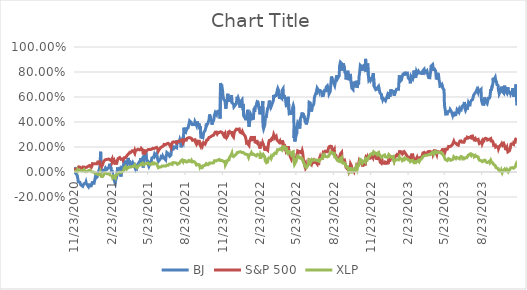
| Category | BJ | S&P 500 | XLP |
|---|---|---|---|
| 11/23/20 | 0.038 | 0.006 | 0 |
| 11/24/20 | 0.029 | 0.022 | 0.007 |
| 11/25/20 | -0.004 | 0.021 | 0.006 |
| 11/27/20 | -0.011 | 0.023 | 0.006 |
| 11/30/20 | -0.024 | 0.019 | 0.006 |
| 12/1/20 | -0.038 | 0.03 | 0.015 |
| 12/2/20 | -0.054 | 0.032 | 0.007 |
| 12/3/20 | -0.078 | 0.032 | 0.009 |
| 12/4/20 | -0.079 | 0.041 | 0.017 |
| 12/7/20 | -0.082 | 0.039 | 0.013 |
| 12/8/20 | -0.078 | 0.042 | 0.019 |
| 12/9/20 | -0.102 | 0.032 | 0.015 |
| 12/10/20 | -0.097 | 0.032 | 0.01 |
| 12/11/20 | -0.106 | 0.031 | 0.012 |
| 12/14/20 | -0.114 | 0.026 | 0.008 |
| 12/15/20 | -0.116 | 0.04 | 0.011 |
| 12/16/20 | -0.115 | 0.042 | 0.013 |
| 12/17/20 | -0.094 | 0.048 | 0.019 |
| 12/18/20 | -0.088 | 0.039 | 0.022 |
| 12/21/20 | -0.09 | 0.035 | 0.002 |
| 12/22/20 | -0.08 | 0.034 | -0.005 |
| 12/23/20 | -0.093 | 0.034 | -0.002 |
| 12/24/20 | -0.09 | 0.038 | 0.003 |
| 12/28/20 | -0.117 | 0.047 | 0.011 |
| 12/29/20 | -0.111 | 0.045 | 0.008 |
| 12/30/20 | -0.093 | 0.047 | 0.007 |
| 12/31/20 | -0.112 | 0.052 | 0.014 |
| 1/4/21 | -0.111 | 0.038 | 0.003 |
| 1/5/21 | -0.113 | 0.045 | 0.003 |
| 1/6/21 | -0.091 | 0.051 | 0.004 |
| 1/7/21 | -0.075 | 0.067 | 0.001 |
| 1/8/21 | -0.09 | 0.073 | 0.006 |
| 1/11/21 | -0.09 | 0.066 | -0.003 |
| 1/12/21 | -0.092 | 0.066 | -0.006 |
| 1/13/21 | -0.09 | 0.069 | -0.004 |
| 1/14/21 | -0.04 | 0.065 | -0.01 |
| 1/15/21 | -0.05 | 0.057 | -0.013 |
| 1/19/21 | -0.037 | 0.066 | -0.017 |
| 1/20/21 | -0.008 | 0.08 | -0.016 |
| 1/21/21 | -0.001 | 0.081 | -0.019 |
| 1/22/21 | 0.006 | 0.078 | -0.022 |
| 1/25/21 | 0.035 | 0.082 | -0.012 |
| 1/26/21 | 0.087 | 0.08 | -0.003 |
| 1/27/21 | 0.162 | 0.054 | -0.02 |
| 1/28/21 | 0.039 | 0.063 | -0.016 |
| 1/29/21 | 0.002 | 0.041 | -0.036 |
| 2/1/21 | 0.011 | 0.059 | -0.035 |
| 2/2/21 | 0.018 | 0.074 | -0.029 |
| 2/3/21 | 0.016 | 0.075 | -0.027 |
| 2/4/21 | 0.001 | 0.087 | -0.02 |
| 2/5/21 | -0.003 | 0.091 | -0.011 |
| 2/8/21 | 0.033 | 0.099 | -0.007 |
| 2/9/21 | 0.041 | 0.098 | -0.008 |
| 2/10/21 | 0.04 | 0.098 | -0.009 |
| 2/11/21 | 0.02 | 0.1 | -0.014 |
| 2/12/21 | 0.024 | 0.105 | -0.012 |
| 2/16/21 | 0.035 | 0.104 | -0.014 |
| 2/17/21 | 0.043 | 0.104 | -0.01 |
| 2/18/21 | 0.066 | 0.1 | -0.011 |
| 2/19/21 | 0.063 | 0.098 | -0.023 |
| 2/22/21 | 0.027 | 0.089 | -0.023 |
| 2/23/21 | -0.004 | 0.091 | -0.021 |
| 2/24/21 | 0.013 | 0.103 | -0.022 |
| 2/25/21 | -0.026 | 0.076 | -0.032 |
| 2/26/21 | -0.043 | 0.07 | -0.048 |
| 3/1/21 | -0.052 | 0.096 | -0.038 |
| 3/2/21 | -0.075 | 0.088 | -0.04 |
| 3/3/21 | -0.081 | 0.073 | -0.045 |
| 3/4/21 | -0.091 | 0.06 | -0.048 |
| 3/5/21 | -0.069 | 0.08 | -0.027 |
| 3/8/21 | -0.032 | 0.074 | -0.023 |
| 3/9/21 | 0.009 | 0.09 | -0.024 |
| 3/10/21 | 0.037 | 0.096 | -0.011 |
| 3/11/21 | 0.004 | 0.108 | -0.013 |
| 3/12/21 | 0.008 | 0.109 | -0.005 |
| 3/15/21 | 0.024 | 0.116 | -0.001 |
| 3/16/21 | 0.001 | 0.114 | 0 |
| 3/17/21 | 0.005 | 0.118 | -0.001 |
| 3/18/21 | -0.036 | 0.102 | -0.005 |
| 3/19/21 | 0.001 | 0.096 | -0.002 |
| 3/22/21 | 0.049 | 0.105 | 0.003 |
| 3/23/21 | 0.045 | 0.096 | 0.008 |
| 3/24/21 | 0.024 | 0.091 | 0.004 |
| 3/25/21 | 0.031 | 0.097 | 0.013 |
| 3/26/21 | 0.088 | 0.114 | 0.031 |
| 3/29/21 | 0.077 | 0.114 | 0.042 |
| 3/30/21 | 0.069 | 0.111 | 0.031 |
| 3/31/21 | 0.068 | 0.115 | 0.027 |
| 4/1/21 | 0.058 | 0.127 | 0.022 |
| 4/5/21 | 0.113 | 0.144 | 0.035 |
| 4/6/21 | 0.083 | 0.143 | 0.04 |
| 4/7/21 | 0.096 | 0.144 | 0.037 |
| 4/8/21 | 0.067 | 0.15 | 0.038 |
| 4/9/21 | 0.056 | 0.158 | 0.036 |
| 4/12/21 | 0.066 | 0.158 | 0.042 |
| 4/13/21 | 0.057 | 0.162 | 0.036 |
| 4/14/21 | 0.059 | 0.158 | 0.035 |
| 4/15/21 | 0.064 | 0.17 | 0.044 |
| 4/16/21 | 0.076 | 0.174 | 0.05 |
| 4/19/21 | 0.058 | 0.169 | 0.046 |
| 4/20/21 | 0.049 | 0.16 | 0.051 |
| 4/21/21 | 0.047 | 0.171 | 0.057 |
| 4/22/21 | 0.031 | 0.16 | 0.049 |
| 4/23/21 | 0.047 | 0.173 | 0.046 |
| 4/26/21 | 0.03 | 0.175 | 0.034 |
| 4/27/21 | 0.028 | 0.175 | 0.034 |
| 4/28/21 | 0.055 | 0.175 | 0.034 |
| 4/29/21 | 0.064 | 0.182 | 0.045 |
| 4/30/21 | 0.064 | 0.174 | 0.046 |
| 5/3/21 | 0.084 | 0.177 | 0.055 |
| 5/4/21 | 0.067 | 0.17 | 0.049 |
| 5/5/21 | 0.087 | 0.17 | 0.049 |
| 5/6/21 | 0.112 | 0.179 | 0.062 |
| 5/7/21 | 0.092 | 0.188 | 0.062 |
| 5/10/21 | 0.11 | 0.176 | 0.07 |
| 5/11/21 | 0.107 | 0.166 | 0.061 |
| 5/12/21 | 0.035 | 0.141 | 0.047 |
| 5/13/21 | 0.095 | 0.155 | 0.062 |
| 5/14/21 | 0.125 | 0.172 | 0.066 |
| 5/17/21 | 0.136 | 0.169 | 0.065 |
| 5/18/21 | 0.161 | 0.159 | 0.062 |
| 5/19/21 | 0.157 | 0.156 | 0.058 |
| 5/20/21 | 0.099 | 0.169 | 0.068 |
| 5/21/21 | 0.087 | 0.168 | 0.068 |
| 5/24/21 | 0.06 | 0.18 | 0.071 |
| 5/25/21 | 0.052 | 0.177 | 0.071 |
| 5/26/21 | 0.065 | 0.179 | 0.069 |
| 5/27/21 | 0.057 | 0.18 | 0.063 |
| 5/28/21 | 0.066 | 0.182 | 0.065 |
| 6/1/21 | 0.089 | 0.181 | 0.061 |
| 6/2/21 | 0.112 | 0.183 | 0.065 |
| 6/3/21 | 0.116 | 0.179 | 0.072 |
| 6/4/21 | 0.113 | 0.189 | 0.075 |
| 6/7/21 | 0.123 | 0.188 | 0.074 |
| 6/8/21 | 0.135 | 0.188 | 0.065 |
| 6/9/21 | 0.125 | 0.187 | 0.06 |
| 6/10/21 | 0.128 | 0.192 | 0.066 |
| 6/11/21 | 0.135 | 0.194 | 0.067 |
| 6/14/21 | 0.149 | 0.197 | 0.066 |
| 6/15/21 | 0.127 | 0.195 | 0.064 |
| 6/16/21 | 0.109 | 0.188 | 0.049 |
| 6/17/21 | 0.115 | 0.188 | 0.053 |
| 6/18/21 | 0.084 | 0.168 | 0.035 |
| 6/21/21 | 0.096 | 0.184 | 0.04 |
| 6/22/21 | 0.103 | 0.191 | 0.041 |
| 6/23/21 | 0.09 | 0.189 | 0.035 |
| 6/24/21 | 0.11 | 0.196 | 0.04 |
| 6/25/21 | 0.123 | 0.201 | 0.048 |
| 6/28/21 | 0.116 | 0.203 | 0.049 |
| 6/29/21 | 0.128 | 0.204 | 0.044 |
| 6/30/21 | 0.133 | 0.205 | 0.052 |
| 7/1/21 | 0.116 | 0.211 | 0.049 |
| 7/2/21 | 0.124 | 0.221 | 0.052 |
| 7/6/21 | 0.097 | 0.218 | 0.047 |
| 7/7/21 | 0.123 | 0.223 | 0.053 |
| 7/8/21 | 0.135 | 0.213 | 0.049 |
| 7/9/21 | 0.156 | 0.226 | 0.055 |
| 7/12/21 | 0.147 | 0.23 | 0.053 |
| 7/13/21 | 0.139 | 0.226 | 0.053 |
| 7/14/21 | 0.135 | 0.228 | 0.062 |
| 7/15/21 | 0.138 | 0.224 | 0.067 |
| 7/16/21 | 0.125 | 0.214 | 0.068 |
| 7/19/21 | 0.135 | 0.196 | 0.065 |
| 7/20/21 | 0.168 | 0.213 | 0.065 |
| 7/21/21 | 0.187 | 0.223 | 0.063 |
| 7/22/21 | 0.19 | 0.226 | 0.061 |
| 7/23/21 | 0.205 | 0.238 | 0.074 |
| 7/26/21 | 0.188 | 0.241 | 0.075 |
| 7/27/21 | 0.187 | 0.235 | 0.078 |
| 7/28/21 | 0.186 | 0.235 | 0.068 |
| 7/29/21 | 0.2 | 0.24 | 0.074 |
| 7/30/21 | 0.206 | 0.234 | 0.075 |
| 8/2/21 | 0.194 | 0.232 | 0.071 |
| 8/3/21 | 0.256 | 0.242 | 0.076 |
| 8/4/21 | 0.232 | 0.235 | 0.062 |
| 8/5/21 | 0.237 | 0.243 | 0.067 |
| 8/6/21 | 0.234 | 0.245 | 0.067 |
| 8/9/21 | 0.244 | 0.244 | 0.071 |
| 8/10/21 | 0.259 | 0.246 | 0.078 |
| 8/11/21 | 0.25 | 0.249 | 0.082 |
| 8/12/21 | 0.228 | 0.253 | 0.081 |
| 8/13/21 | 0.197 | 0.255 | 0.09 |
| 8/16/21 | 0.249 | 0.258 | 0.097 |
| 8/17/21 | 0.256 | 0.25 | 0.097 |
| 8/18/21 | 0.236 | 0.236 | 0.084 |
| 8/19/21 | 0.286 | 0.238 | 0.092 |
| 8/20/21 | 0.355 | 0.248 | 0.094 |
| 8/23/21 | 0.307 | 0.259 | 0.091 |
| 8/24/21 | 0.319 | 0.261 | 0.082 |
| 8/25/21 | 0.349 | 0.263 | 0.081 |
| 8/26/21 | 0.337 | 0.256 | 0.076 |
| 8/27/21 | 0.347 | 0.267 | 0.079 |
| 8/30/21 | 0.351 | 0.273 | 0.084 |
| 8/31/21 | 0.349 | 0.271 | 0.087 |
| 9/1/21 | 0.349 | 0.271 | 0.092 |
| 9/2/21 | 0.392 | 0.275 | 0.097 |
| 9/3/21 | 0.409 | 0.275 | 0.095 |
| 9/7/21 | 0.397 | 0.271 | 0.083 |
| 9/8/21 | 0.391 | 0.269 | 0.092 |
| 9/9/21 | 0.38 | 0.264 | 0.086 |
| 9/10/21 | 0.387 | 0.254 | 0.081 |
| 9/13/21 | 0.38 | 0.257 | 0.084 |
| 9/14/21 | 0.369 | 0.25 | 0.079 |
| 9/15/21 | 0.387 | 0.26 | 0.083 |
| 9/16/21 | 0.402 | 0.258 | 0.079 |
| 9/17/21 | 0.399 | 0.242 | 0.073 |
| 9/20/21 | 0.371 | 0.222 | 0.056 |
| 9/21/21 | 0.393 | 0.22 | 0.055 |
| 9/22/21 | 0.404 | 0.232 | 0.058 |
| 9/23/21 | 0.384 | 0.247 | 0.062 |
| 9/24/21 | 0.39 | 0.249 | 0.062 |
| 9/27/21 | 0.38 | 0.246 | 0.057 |
| 9/28/21 | 0.342 | 0.221 | 0.045 |
| 9/29/21 | 0.367 | 0.223 | 0.054 |
| 9/30/21 | 0.308 | 0.208 | 0.035 |
| 10/1/21 | 0.269 | 0.222 | 0.038 |
| 10/4/21 | 0.292 | 0.206 | 0.035 |
| 10/5/21 | 0.298 | 0.219 | 0.04 |
| 10/6/21 | 0.282 | 0.224 | 0.05 |
| 10/7/21 | 0.303 | 0.235 | 0.055 |
| 10/8/21 | 0.318 | 0.232 | 0.053 |
| 10/11/21 | 0.332 | 0.223 | 0.053 |
| 10/12/21 | 0.335 | 0.22 | 0.054 |
| 10/13/21 | 0.356 | 0.225 | 0.055 |
| 10/14/21 | 0.387 | 0.245 | 0.067 |
| 10/15/21 | 0.374 | 0.255 | 0.065 |
| 10/18/21 | 0.39 | 0.259 | 0.058 |
| 10/19/21 | 0.398 | 0.268 | 0.059 |
| 10/20/21 | 0.39 | 0.273 | 0.065 |
| 10/21/21 | 0.422 | 0.277 | 0.064 |
| 10/22/21 | 0.46 | 0.275 | 0.072 |
| 10/25/21 | 0.429 | 0.282 | 0.071 |
| 10/26/21 | 0.425 | 0.283 | 0.075 |
| 10/27/21 | 0.408 | 0.278 | 0.069 |
| 10/28/21 | 0.379 | 0.29 | 0.072 |
| 10/29/21 | 0.391 | 0.292 | 0.071 |
| 11/1/21 | 0.413 | 0.295 | 0.073 |
| 11/2/21 | 0.427 | 0.3 | 0.08 |
| 11/3/21 | 0.456 | 0.308 | 0.09 |
| 11/4/21 | 0.465 | 0.314 | 0.091 |
| 11/5/21 | 0.476 | 0.319 | 0.098 |
| 11/8/21 | 0.46 | 0.32 | 0.089 |
| 11/9/21 | 0.49 | 0.315 | 0.093 |
| 11/10/21 | 0.47 | 0.305 | 0.096 |
| 11/11/21 | 0.457 | 0.305 | 0.095 |
| 11/12/21 | 0.486 | 0.315 | 0.095 |
| 11/15/21 | 0.486 | 0.315 | 0.101 |
| 11/16/21 | 0.466 | 0.321 | 0.094 |
| 11/17/21 | 0.428 | 0.317 | 0.091 |
| 11/18/21 | 0.713 | 0.322 | 0.087 |
| 11/19/21 | 0.657 | 0.32 | 0.083 |
| 11/22/21 | 0.675 | 0.316 | 0.092 |
| 11/23/21 | 0.653 | 0.318 | 0.099 |
| 11/24/21 | 0.612 | 0.321 | 0.096 |
| 11/26/21 | 0.58 | 0.292 | 0.082 |
| 11/29/21 | 0.569 | 0.308 | 0.085 |
| 11/30/21 | 0.575 | 0.282 | 0.057 |
| 12/1/21 | 0.506 | 0.268 | 0.052 |
| 12/2/21 | 0.533 | 0.287 | 0.063 |
| 12/3/21 | 0.548 | 0.276 | 0.076 |
| 12/6/21 | 0.626 | 0.291 | 0.095 |
| 12/7/21 | 0.621 | 0.318 | 0.098 |
| 12/8/21 | 0.571 | 0.321 | 0.094 |
| 12/9/21 | 0.562 | 0.312 | 0.097 |
| 12/10/21 | 0.605 | 0.325 | 0.116 |
| 12/13/21 | 0.585 | 0.313 | 0.13 |
| 12/14/21 | 0.567 | 0.304 | 0.131 |
| 12/15/21 | 0.614 | 0.324 | 0.142 |
| 12/16/21 | 0.554 | 0.313 | 0.151 |
| 12/17/21 | 0.558 | 0.294 | 0.131 |
| 12/20/21 | 0.543 | 0.28 | 0.123 |
| 12/21/21 | 0.521 | 0.303 | 0.122 |
| 12/22/21 | 0.527 | 0.316 | 0.129 |
| 12/23/21 | 0.53 | 0.324 | 0.132 |
| 12/27/21 | 0.547 | 0.343 | 0.144 |
| 12/28/21 | 0.579 | 0.342 | 0.15 |
| 12/29/21 | 0.602 | 0.344 | 0.155 |
| 12/30/21 | 0.586 | 0.34 | 0.152 |
| 12/31/21 | 0.595 | 0.337 | 0.16 |
| 1/3/22 | 0.564 | 0.344 | 0.159 |
| 1/4/22 | 0.56 | 0.344 | 0.167 |
| 1/5/22 | 0.515 | 0.318 | 0.166 |
| 1/6/22 | 0.544 | 0.317 | 0.163 |
| 1/7/22 | 0.564 | 0.312 | 0.164 |
| 1/10/22 | 0.577 | 0.31 | 0.155 |
| 1/11/22 | 0.532 | 0.322 | 0.154 |
| 1/12/22 | 0.538 | 0.326 | 0.154 |
| 1/13/22 | 0.545 | 0.307 | 0.156 |
| 1/14/22 | 0.448 | 0.308 | 0.158 |
| 1/18/22 | 0.428 | 0.285 | 0.142 |
| 1/19/22 | 0.414 | 0.271 | 0.149 |
| 1/20/22 | 0.412 | 0.257 | 0.141 |
| 1/21/22 | 0.441 | 0.233 | 0.142 |
| 1/24/22 | 0.497 | 0.238 | 0.138 |
| 1/25/22 | 0.449 | 0.223 | 0.126 |
| 1/26/22 | 0.398 | 0.22 | 0.117 |
| 1/27/22 | 0.362 | 0.214 | 0.125 |
| 1/28/22 | 0.379 | 0.244 | 0.138 |
| 1/31/22 | 0.464 | 0.266 | 0.142 |
| 2/1/22 | 0.468 | 0.275 | 0.141 |
| 2/2/22 | 0.451 | 0.287 | 0.155 |
| 2/3/22 | 0.45 | 0.257 | 0.155 |
| 2/4/22 | 0.425 | 0.263 | 0.141 |
| 2/7/22 | 0.428 | 0.259 | 0.143 |
| 2/8/22 | 0.49 | 0.269 | 0.148 |
| 2/9/22 | 0.51 | 0.288 | 0.148 |
| 2/10/22 | 0.48 | 0.265 | 0.136 |
| 2/11/22 | 0.518 | 0.24 | 0.132 |
| 2/14/22 | 0.531 | 0.236 | 0.128 |
| 2/15/22 | 0.545 | 0.255 | 0.13 |
| 2/16/22 | 0.537 | 0.257 | 0.132 |
| 2/17/22 | 0.57 | 0.23 | 0.141 |
| 2/18/22 | 0.568 | 0.222 | 0.143 |
| 2/22/22 | 0.495 | 0.209 | 0.134 |
| 2/23/22 | 0.461 | 0.187 | 0.125 |
| 2/24/22 | 0.484 | 0.205 | 0.106 |
| 2/25/22 | 0.524 | 0.232 | 0.142 |
| 2/28/22 | 0.497 | 0.229 | 0.126 |
| 3/1/22 | 0.509 | 0.21 | 0.12 |
| 3/2/22 | 0.569 | 0.232 | 0.132 |
| 3/3/22 | 0.361 | 0.226 | 0.141 |
| 3/4/22 | 0.346 | 0.216 | 0.141 |
| 3/7/22 | 0.376 | 0.18 | 0.12 |
| 3/8/22 | 0.419 | 0.171 | 0.09 |
| 3/9/22 | 0.447 | 0.203 | 0.097 |
| 3/10/22 | 0.434 | 0.197 | 0.087 |
| 3/11/22 | 0.453 | 0.182 | 0.074 |
| 3/14/22 | 0.51 | 0.174 | 0.08 |
| 3/15/22 | 0.511 | 0.199 | 0.104 |
| 3/16/22 | 0.522 | 0.226 | 0.105 |
| 3/17/22 | 0.543 | 0.241 | 0.113 |
| 3/18/22 | 0.571 | 0.251 | 0.116 |
| 3/21/22 | 0.526 | 0.251 | 0.112 |
| 3/22/22 | 0.535 | 0.265 | 0.12 |
| 3/23/22 | 0.527 | 0.249 | 0.111 |
| 3/24/22 | 0.534 | 0.268 | 0.119 |
| 3/25/22 | 0.527 | 0.274 | 0.128 |
| 3/28/22 | 0.572 | 0.283 | 0.133 |
| 3/29/22 | 0.616 | 0.299 | 0.143 |
| 3/30/22 | 0.596 | 0.291 | 0.144 |
| 3/31/22 | 0.61 | 0.271 | 0.141 |
| 4/1/22 | 0.61 | 0.275 | 0.153 |
| 4/4/22 | 0.612 | 0.286 | 0.149 |
| 4/5/22 | 0.611 | 0.269 | 0.15 |
| 4/6/22 | 0.619 | 0.257 | 0.165 |
| 4/7/22 | 0.658 | 0.263 | 0.179 |
| 4/8/22 | 0.669 | 0.26 | 0.184 |
| 4/11/22 | 0.644 | 0.238 | 0.179 |
| 4/12/22 | 0.584 | 0.233 | 0.179 |
| 4/13/22 | 0.62 | 0.248 | 0.186 |
| 4/14/22 | 0.604 | 0.232 | 0.186 |
| 4/18/22 | 0.589 | 0.233 | 0.176 |
| 4/19/22 | 0.656 | 0.252 | 0.194 |
| 4/20/22 | 0.663 | 0.252 | 0.212 |
| 4/21/22 | 0.666 | 0.233 | 0.211 |
| 4/22/22 | 0.6 | 0.199 | 0.192 |
| 4/25/22 | 0.603 | 0.206 | 0.197 |
| 4/26/22 | 0.585 | 0.171 | 0.178 |
| 4/27/22 | 0.598 | 0.174 | 0.183 |
| 4/28/22 | 0.601 | 0.204 | 0.2 |
| 4/29/22 | 0.532 | 0.159 | 0.168 |
| 5/2/22 | 0.537 | 0.166 | 0.152 |
| 5/3/22 | 0.557 | 0.172 | 0.149 |
| 5/4/22 | 0.601 | 0.207 | 0.175 |
| 5/5/22 | 0.505 | 0.165 | 0.152 |
| 5/6/22 | 0.469 | 0.158 | 0.154 |
| 5/9/22 | 0.475 | 0.121 | 0.153 |
| 5/10/22 | 0.458 | 0.123 | 0.145 |
| 5/11/22 | 0.452 | 0.105 | 0.14 |
| 5/12/22 | 0.486 | 0.104 | 0.14 |
| 5/13/22 | 0.484 | 0.131 | 0.157 |
| 5/16/22 | 0.532 | 0.126 | 0.162 |
| 5/17/22 | 0.519 | 0.149 | 0.154 |
| 5/18/22 | 0.272 | 0.103 | 0.08 |
| 5/19/22 | 0.366 | 0.096 | 0.061 |
| 5/20/22 | 0.245 | 0.097 | 0.063 |
| 5/23/22 | 0.299 | 0.117 | 0.085 |
| 5/24/22 | 0.296 | 0.109 | 0.103 |
| 5/25/22 | 0.31 | 0.118 | 0.103 |
| 5/26/22 | 0.378 | 0.141 | 0.115 |
| 5/27/22 | 0.396 | 0.169 | 0.128 |
| 5/31/22 | 0.378 | 0.162 | 0.12 |
| 6/1/22 | 0.348 | 0.153 | 0.105 |
| 6/2/22 | 0.418 | 0.175 | 0.121 |
| 6/3/22 | 0.424 | 0.155 | 0.11 |
| 6/6/22 | 0.458 | 0.159 | 0.111 |
| 6/7/22 | 0.476 | 0.17 | 0.116 |
| 6/8/22 | 0.435 | 0.157 | 0.103 |
| 6/9/22 | 0.468 | 0.13 | 0.086 |
| 6/10/22 | 0.461 | 0.097 | 0.082 |
| 6/13/22 | 0.43 | 0.055 | 0.058 |
| 6/14/22 | 0.405 | 0.052 | 0.046 |
| 6/15/22 | 0.412 | 0.067 | 0.047 |
| 6/16/22 | 0.395 | 0.032 | 0.039 |
| 6/17/22 | 0.38 | 0.03 | 0.035 |
| 6/21/22 | 0.432 | 0.056 | 0.055 |
| 6/22/22 | 0.429 | 0.054 | 0.054 |
| 6/23/22 | 0.465 | 0.064 | 0.074 |
| 6/24/22 | 0.558 | 0.098 | 0.095 |
| 6/27/22 | 0.552 | 0.094 | 0.092 |
| 6/28/22 | 0.515 | 0.071 | 0.078 |
| 6/29/22 | 0.496 | 0.07 | 0.085 |
| 6/30/22 | 0.484 | 0.062 | 0.085 |
| 7/1/22 | 0.515 | 0.073 | 0.101 |
| 7/5/22 | 0.54 | 0.075 | 0.094 |
| 7/6/22 | 0.554 | 0.079 | 0.097 |
| 7/7/22 | 0.594 | 0.095 | 0.098 |
| 7/8/22 | 0.607 | 0.094 | 0.096 |
| 7/11/22 | 0.634 | 0.081 | 0.095 |
| 7/12/22 | 0.62 | 0.072 | 0.092 |
| 7/13/22 | 0.623 | 0.066 | 0.092 |
| 7/14/22 | 0.67 | 0.064 | 0.093 |
| 7/15/22 | 0.664 | 0.084 | 0.097 |
| 7/18/22 | 0.65 | 0.075 | 0.086 |
| 7/19/22 | 0.642 | 0.104 | 0.098 |
| 7/20/22 | 0.661 | 0.111 | 0.09 |
| 7/21/22 | 0.646 | 0.122 | 0.094 |
| 7/22/22 | 0.654 | 0.112 | 0.101 |
| 7/25/22 | 0.642 | 0.113 | 0.106 |
| 7/26/22 | 0.611 | 0.1 | 0.104 |
| 7/27/22 | 0.619 | 0.129 | 0.111 |
| 7/28/22 | 0.612 | 0.143 | 0.129 |
| 7/29/22 | 0.612 | 0.159 | 0.12 |
| 8/1/22 | 0.653 | 0.156 | 0.134 |
| 8/2/22 | 0.649 | 0.148 | 0.125 |
| 8/3/22 | 0.654 | 0.166 | 0.132 |
| 8/4/22 | 0.651 | 0.166 | 0.125 |
| 8/5/22 | 0.679 | 0.164 | 0.122 |
| 8/8/22 | 0.69 | 0.162 | 0.122 |
| 8/9/22 | 0.679 | 0.158 | 0.12 |
| 8/10/22 | 0.686 | 0.182 | 0.128 |
| 8/11/22 | 0.656 | 0.182 | 0.126 |
| 8/12/22 | 0.626 | 0.202 | 0.135 |
| 8/15/22 | 0.645 | 0.207 | 0.147 |
| 8/16/22 | 0.649 | 0.209 | 0.16 |
| 8/17/22 | 0.646 | 0.201 | 0.156 |
| 8/18/22 | 0.764 | 0.204 | 0.16 |
| 8/19/22 | 0.757 | 0.188 | 0.157 |
| 8/22/22 | 0.719 | 0.163 | 0.145 |
| 8/23/22 | 0.72 | 0.16 | 0.14 |
| 8/24/22 | 0.708 | 0.164 | 0.143 |
| 8/25/22 | 0.715 | 0.181 | 0.148 |
| 8/26/22 | 0.692 | 0.141 | 0.12 |
| 8/29/22 | 0.745 | 0.133 | 0.118 |
| 8/30/22 | 0.746 | 0.121 | 0.106 |
| 8/31/22 | 0.774 | 0.112 | 0.099 |
| 9/1/22 | 0.773 | 0.116 | 0.106 |
| 9/2/22 | 0.747 | 0.104 | 0.091 |
| 9/6/22 | 0.77 | 0.1 | 0.085 |
| 9/7/22 | 0.847 | 0.119 | 0.105 |
| 9/8/22 | 0.865 | 0.127 | 0.102 |
| 9/9/22 | 0.879 | 0.144 | 0.112 |
| 9/12/22 | 0.868 | 0.157 | 0.117 |
| 9/13/22 | 0.811 | 0.106 | 0.08 |
| 9/14/22 | 0.837 | 0.111 | 0.079 |
| 9/15/22 | 0.82 | 0.098 | 0.07 |
| 9/16/22 | 0.868 | 0.085 | 0.073 |
| 9/19/22 | 0.831 | 0.093 | 0.073 |
| 9/20/22 | 0.798 | 0.081 | 0.067 |
| 9/21/22 | 0.801 | 0.062 | 0.063 |
| 9/22/22 | 0.786 | 0.053 | 0.061 |
| 9/23/22 | 0.741 | 0.036 | 0.043 |
| 9/26/22 | 0.796 | 0.025 | 0.044 |
| 9/27/22 | 0.81 | 0.023 | 0.026 |
| 9/28/22 | 0.811 | 0.043 | 0.038 |
| 9/29/22 | 0.773 | 0.021 | 0.021 |
| 9/30/22 | 0.734 | 0.005 | 0.003 |
| 10/3/22 | 0.784 | 0.032 | 0.021 |
| 10/4/22 | 0.773 | 0.064 | 0.036 |
| 10/5/22 | 0.72 | 0.061 | 0.03 |
| 10/6/22 | 0.698 | 0.05 | 0.015 |
| 10/7/22 | 0.672 | 0.021 | 0 |
| 10/10/22 | 0.66 | 0.013 | 0.004 |
| 10/11/22 | 0.722 | 0.007 | 0.012 |
| 10/12/22 | 0.705 | 0.003 | 0.017 |
| 10/13/22 | 0.719 | 0.03 | 0.034 |
| 10/14/22 | 0.691 | 0.006 | 0.015 |
| 10/17/22 | 0.701 | 0.032 | 0.026 |
| 10/18/22 | 0.73 | 0.044 | 0.04 |
| 10/19/22 | 0.713 | 0.037 | 0.035 |
| 10/20/22 | 0.672 | 0.028 | 0.021 |
| 10/21/22 | 0.695 | 0.053 | 0.036 |
| 10/24/22 | 0.708 | 0.066 | 0.055 |
| 10/25/22 | 0.767 | 0.083 | 0.069 |
| 10/26/22 | 0.786 | 0.075 | 0.076 |
| 10/27/22 | 0.82 | 0.069 | 0.077 |
| 10/28/22 | 0.853 | 0.095 | 0.1 |
| 10/31/22 | 0.843 | 0.087 | 0.094 |
| 11/1/22 | 0.853 | 0.082 | 0.09 |
| 11/2/22 | 0.812 | 0.055 | 0.071 |
| 11/3/22 | 0.849 | 0.044 | 0.068 |
| 11/4/22 | 0.826 | 0.059 | 0.08 |
| 11/7/22 | 0.862 | 0.069 | 0.09 |
| 11/8/22 | 0.839 | 0.075 | 0.093 |
| 11/9/22 | 0.847 | 0.053 | 0.081 |
| 11/10/22 | 0.905 | 0.111 | 0.107 |
| 11/11/22 | 0.813 | 0.122 | 0.106 |
| 11/14/22 | 0.813 | 0.112 | 0.097 |
| 11/15/22 | 0.868 | 0.121 | 0.106 |
| 11/16/22 | 0.866 | 0.113 | 0.111 |
| 11/17/22 | 0.762 | 0.11 | 0.111 |
| 11/18/22 | 0.731 | 0.115 | 0.123 |
| 11/21/22 | 0.741 | 0.11 | 0.134 |
| 11/22/22 | 0.757 | 0.125 | 0.142 |
| 11/23/22 | 0.738 | 0.133 | 0.146 |
| 11/25/22 | 0.75 | 0.132 | 0.147 |
| 11/28/22 | 0.775 | 0.114 | 0.142 |
| 11/29/22 | 0.79 | 0.112 | 0.138 |
| 11/30/22 | 0.791 | 0.147 | 0.161 |
| 12/1/22 | 0.684 | 0.146 | 0.155 |
| 12/2/22 | 0.686 | 0.145 | 0.161 |
| 12/5/22 | 0.658 | 0.125 | 0.146 |
| 12/6/22 | 0.661 | 0.108 | 0.139 |
| 12/7/22 | 0.653 | 0.106 | 0.144 |
| 12/8/22 | 0.663 | 0.115 | 0.15 |
| 12/9/22 | 0.673 | 0.107 | 0.141 |
| 12/12/22 | 0.686 | 0.123 | 0.153 |
| 12/13/22 | 0.673 | 0.131 | 0.152 |
| 12/14/22 | 0.675 | 0.124 | 0.151 |
| 12/15/22 | 0.635 | 0.097 | 0.131 |
| 12/16/22 | 0.628 | 0.079 | 0.126 |
| 12/19/22 | 0.618 | 0.069 | 0.117 |
| 12/20/22 | 0.583 | 0.071 | 0.116 |
| 12/21/22 | 0.592 | 0.087 | 0.127 |
| 12/22/22 | 0.58 | 0.071 | 0.125 |
| 12/23/22 | 0.589 | 0.078 | 0.131 |
| 12/27/22 | 0.579 | 0.073 | 0.136 |
| 12/28/22 | 0.581 | 0.06 | 0.122 |
| 12/29/22 | 0.57 | 0.079 | 0.127 |
| 12/30/22 | 0.575 | 0.076 | 0.121 |
| 1/3/23 | 0.616 | 0.072 | 0.117 |
| 1/4/23 | 0.608 | 0.08 | 0.121 |
| 1/5/23 | 0.584 | 0.068 | 0.11 |
| 1/6/23 | 0.639 | 0.092 | 0.14 |
| 1/9/23 | 0.602 | 0.092 | 0.128 |
| 1/10/23 | 0.596 | 0.099 | 0.127 |
| 1/11/23 | 0.66 | 0.113 | 0.128 |
| 1/12/23 | 0.651 | 0.117 | 0.119 |
| 1/13/23 | 0.644 | 0.121 | 0.124 |
| 1/17/23 | 0.645 | 0.119 | 0.125 |
| 1/18/23 | 0.632 | 0.102 | 0.094 |
| 1/19/23 | 0.61 | 0.094 | 0.084 |
| 1/20/23 | 0.617 | 0.114 | 0.092 |
| 1/23/23 | 0.649 | 0.127 | 0.095 |
| 1/24/23 | 0.653 | 0.126 | 0.1 |
| 1/25/23 | 0.662 | 0.127 | 0.103 |
| 1/26/23 | 0.659 | 0.139 | 0.099 |
| 1/27/23 | 0.66 | 0.142 | 0.096 |
| 1/30/23 | 0.662 | 0.127 | 0.097 |
| 1/31/23 | 0.725 | 0.144 | 0.109 |
| 2/1/23 | 0.773 | 0.156 | 0.118 |
| 2/2/23 | 0.77 | 0.173 | 0.108 |
| 2/3/23 | 0.726 | 0.16 | 0.104 |
| 2/6/23 | 0.735 | 0.153 | 0.105 |
| 2/7/23 | 0.74 | 0.168 | 0.1 |
| 2/8/23 | 0.732 | 0.156 | 0.092 |
| 2/9/23 | 0.774 | 0.146 | 0.087 |
| 2/10/23 | 0.783 | 0.148 | 0.097 |
| 2/13/23 | 0.785 | 0.162 | 0.11 |
| 2/14/23 | 0.771 | 0.161 | 0.1 |
| 2/15/23 | 0.801 | 0.165 | 0.102 |
| 2/16/23 | 0.795 | 0.149 | 0.094 |
| 2/17/23 | 0.786 | 0.146 | 0.108 |
| 2/21/23 | 0.79 | 0.123 | 0.104 |
| 2/22/23 | 0.772 | 0.122 | 0.102 |
| 2/23/23 | 0.751 | 0.128 | 0.101 |
| 2/24/23 | 0.749 | 0.116 | 0.093 |
| 2/27/23 | 0.737 | 0.119 | 0.092 |
| 2/28/23 | 0.71 | 0.115 | 0.083 |
| 3/1/23 | 0.712 | 0.111 | 0.075 |
| 3/2/23 | 0.765 | 0.12 | 0.09 |
| 3/3/23 | 0.761 | 0.138 | 0.091 |
| 3/6/23 | 0.745 | 0.138 | 0.094 |
| 3/7/23 | 0.753 | 0.121 | 0.083 |
| 3/8/23 | 0.769 | 0.123 | 0.085 |
| 3/9/23 | 0.811 | 0.102 | 0.075 |
| 3/10/23 | 0.78 | 0.086 | 0.069 |
| 3/13/23 | 0.752 | 0.085 | 0.075 |
| 3/14/23 | 0.782 | 0.102 | 0.085 |
| 3/15/23 | 0.804 | 0.096 | 0.092 |
| 3/16/23 | 0.806 | 0.115 | 0.092 |
| 3/17/23 | 0.789 | 0.098 | 0.084 |
| 3/20/23 | 0.806 | 0.108 | 0.094 |
| 3/21/23 | 0.811 | 0.123 | 0.093 |
| 3/22/23 | 0.793 | 0.104 | 0.083 |
| 3/23/23 | 0.789 | 0.106 | 0.079 |
| 3/24/23 | 0.79 | 0.114 | 0.097 |
| 3/27/23 | 0.79 | 0.116 | 0.103 |
| 3/28/23 | 0.804 | 0.113 | 0.105 |
| 3/29/23 | 0.79 | 0.13 | 0.111 |
| 3/30/23 | 0.78 | 0.136 | 0.114 |
| 3/31/23 | 0.811 | 0.152 | 0.123 |
| 4/3/23 | 0.822 | 0.157 | 0.129 |
| 4/4/23 | 0.804 | 0.15 | 0.127 |
| 4/5/23 | 0.815 | 0.147 | 0.132 |
| 4/6/23 | 0.796 | 0.152 | 0.133 |
| 4/10/23 | 0.809 | 0.153 | 0.133 |
| 4/11/23 | 0.813 | 0.153 | 0.137 |
| 4/12/23 | 0.78 | 0.148 | 0.131 |
| 4/13/23 | 0.78 | 0.164 | 0.138 |
| 4/14/23 | 0.755 | 0.161 | 0.131 |
| 4/17/23 | 0.754 | 0.165 | 0.138 |
| 4/18/23 | 0.781 | 0.166 | 0.141 |
| 4/19/23 | 0.805 | 0.166 | 0.14 |
| 4/20/23 | 0.845 | 0.159 | 0.143 |
| 4/21/23 | 0.845 | 0.16 | 0.151 |
| 4/24/23 | 0.859 | 0.161 | 0.156 |
| 4/25/23 | 0.839 | 0.143 | 0.155 |
| 4/26/23 | 0.811 | 0.138 | 0.146 |
| 4/27/23 | 0.833 | 0.161 | 0.158 |
| 4/28/23 | 0.818 | 0.171 | 0.165 |
| 5/1/23 | 0.811 | 0.169 | 0.165 |
| 5/2/23 | 0.785 | 0.156 | 0.162 |
| 5/3/23 | 0.74 | 0.148 | 0.153 |
| 5/4/23 | 0.749 | 0.14 | 0.15 |
| 5/5/23 | 0.785 | 0.161 | 0.161 |
| 5/8/23 | 0.783 | 0.162 | 0.157 |
| 5/9/23 | 0.761 | 0.156 | 0.154 |
| 5/10/23 | 0.732 | 0.162 | 0.152 |
| 5/11/23 | 0.717 | 0.16 | 0.155 |
| 5/12/23 | 0.686 | 0.158 | 0.16 |
| 5/15/23 | 0.689 | 0.162 | 0.157 |
| 5/16/23 | 0.689 | 0.155 | 0.147 |
| 5/17/23 | 0.699 | 0.169 | 0.146 |
| 5/18/23 | 0.689 | 0.18 | 0.141 |
| 5/19/23 | 0.67 | 0.178 | 0.142 |
| 5/22/23 | 0.657 | 0.179 | 0.124 |
| 5/23/23 | 0.537 | 0.165 | 0.116 |
| 5/24/23 | 0.512 | 0.157 | 0.109 |
| 5/25/23 | 0.495 | 0.167 | 0.1 |
| 5/26/23 | 0.463 | 0.182 | 0.104 |
| 5/30/23 | 0.464 | 0.183 | 0.092 |
| 5/31/23 | 0.492 | 0.176 | 0.093 |
| 6/1/23 | 0.48 | 0.187 | 0.092 |
| 6/2/23 | 0.477 | 0.204 | 0.107 |
| 6/5/23 | 0.49 | 0.202 | 0.103 |
| 6/6/23 | 0.5 | 0.205 | 0.097 |
| 6/7/23 | 0.505 | 0.2 | 0.094 |
| 6/8/23 | 0.494 | 0.208 | 0.101 |
| 6/9/23 | 0.483 | 0.21 | 0.099 |
| 6/12/23 | 0.455 | 0.221 | 0.099 |
| 6/13/23 | 0.469 | 0.229 | 0.104 |
| 6/14/23 | 0.481 | 0.23 | 0.11 |
| 6/15/23 | 0.479 | 0.246 | 0.122 |
| 6/16/23 | 0.454 | 0.237 | 0.123 |
| 6/20/23 | 0.458 | 0.23 | 0.106 |
| 6/21/23 | 0.457 | 0.224 | 0.11 |
| 6/22/23 | 0.479 | 0.228 | 0.117 |
| 6/23/23 | 0.497 | 0.219 | 0.109 |
| 6/26/23 | 0.484 | 0.214 | 0.111 |
| 6/27/23 | 0.491 | 0.228 | 0.114 |
| 6/28/23 | 0.501 | 0.228 | 0.107 |
| 6/29/23 | 0.489 | 0.233 | 0.106 |
| 6/30/23 | 0.5 | 0.248 | 0.115 |
| 7/3/23 | 0.496 | 0.249 | 0.124 |
| 7/5/23 | 0.524 | 0.247 | 0.122 |
| 7/6/23 | 0.53 | 0.237 | 0.119 |
| 7/7/23 | 0.518 | 0.234 | 0.105 |
| 7/10/23 | 0.54 | 0.237 | 0.104 |
| 7/11/23 | 0.56 | 0.245 | 0.106 |
| 7/12/23 | 0.557 | 0.255 | 0.109 |
| 7/13/23 | 0.504 | 0.265 | 0.113 |
| 7/14/23 | 0.494 | 0.264 | 0.117 |
| 7/17/23 | 0.518 | 0.269 | 0.114 |
| 7/18/23 | 0.5 | 0.278 | 0.112 |
| 7/19/23 | 0.518 | 0.281 | 0.124 |
| 7/20/23 | 0.527 | 0.273 | 0.133 |
| 7/21/23 | 0.55 | 0.273 | 0.137 |
| 7/24/23 | 0.526 | 0.278 | 0.142 |
| 7/25/23 | 0.553 | 0.282 | 0.141 |
| 7/26/23 | 0.547 | 0.282 | 0.143 |
| 7/27/23 | 0.56 | 0.273 | 0.133 |
| 7/28/23 | 0.572 | 0.286 | 0.144 |
| 7/31/23 | 0.579 | 0.288 | 0.139 |
| 8/1/23 | 0.59 | 0.285 | 0.133 |
| 8/2/23 | 0.59 | 0.267 | 0.137 |
| 8/3/23 | 0.616 | 0.263 | 0.134 |
| 8/4/23 | 0.62 | 0.257 | 0.123 |
| 8/7/23 | 0.635 | 0.268 | 0.132 |
| 8/8/23 | 0.627 | 0.263 | 0.124 |
| 8/9/23 | 0.645 | 0.254 | 0.125 |
| 8/10/23 | 0.646 | 0.255 | 0.123 |
| 8/11/23 | 0.661 | 0.254 | 0.125 |
| 8/14/23 | 0.636 | 0.261 | 0.119 |
| 8/15/23 | 0.651 | 0.246 | 0.107 |
| 8/16/23 | 0.648 | 0.237 | 0.105 |
| 8/17/23 | 0.633 | 0.228 | 0.094 |
| 8/18/23 | 0.65 | 0.228 | 0.098 |
| 8/21/23 | 0.66 | 0.236 | 0.091 |
| 8/22/23 | 0.575 | 0.233 | 0.085 |
| 8/23/23 | 0.576 | 0.247 | 0.092 |
| 8/24/23 | 0.551 | 0.23 | 0.083 |
| 8/25/23 | 0.542 | 0.238 | 0.089 |
| 8/28/23 | 0.541 | 0.246 | 0.094 |
| 8/29/23 | 0.58 | 0.264 | 0.098 |
| 8/30/23 | 0.597 | 0.269 | 0.1 |
| 8/31/23 | 0.605 | 0.267 | 0.094 |
| 9/1/23 | 0.565 | 0.27 | 0.085 |
| 9/5/23 | 0.547 | 0.264 | 0.075 |
| 9/6/23 | 0.554 | 0.256 | 0.074 |
| 9/7/23 | 0.549 | 0.252 | 0.077 |
| 9/8/23 | 0.59 | 0.254 | 0.078 |
| 9/11/23 | 0.593 | 0.262 | 0.088 |
| 9/12/23 | 0.604 | 0.255 | 0.078 |
| 9/13/23 | 0.606 | 0.257 | 0.082 |
| 9/14/23 | 0.663 | 0.267 | 0.092 |
| 9/15/23 | 0.652 | 0.248 | 0.083 |
| 9/18/23 | 0.694 | 0.249 | 0.076 |
| 9/19/23 | 0.703 | 0.246 | 0.073 |
| 9/20/23 | 0.754 | 0.234 | 0.074 |
| 9/21/23 | 0.72 | 0.214 | 0.06 |
| 9/22/23 | 0.735 | 0.211 | 0.055 |
| 9/25/23 | 0.756 | 0.216 | 0.051 |
| 9/26/23 | 0.736 | 0.199 | 0.043 |
| 9/27/23 | 0.737 | 0.199 | 0.035 |
| 9/28/23 | 0.721 | 0.206 | 0.038 |
| 9/29/23 | 0.699 | 0.203 | 0.035 |
| 10/2/23 | 0.691 | 0.203 | 0.028 |
| 10/3/23 | 0.645 | 0.186 | 0.02 |
| 10/4/23 | 0.67 | 0.195 | 0.028 |
| 10/5/23 | 0.627 | 0.195 | 0.008 |
| 10/6/23 | 0.628 | 0.209 | 0.003 |
| 10/9/23 | 0.654 | 0.217 | 0.003 |
| 10/10/23 | 0.683 | 0.223 | 0.014 |
| 10/11/23 | 0.671 | 0.228 | 0.007 |
| 10/12/23 | 0.646 | 0.22 | -0.004 |
| 10/13/23 | 0.645 | 0.214 | 0.005 |
| 10/16/23 | 0.631 | 0.227 | 0.015 |
| 10/17/23 | 0.655 | 0.227 | 0.019 |
| 10/18/23 | 0.691 | 0.211 | 0.023 |
| 10/19/23 | 0.662 | 0.2 | 0.015 |
| 10/20/23 | 0.649 | 0.185 | 0.012 |
| 10/23/23 | 0.635 | 0.183 | 0.01 |
| 10/24/23 | 0.677 | 0.192 | 0.018 |
| 10/25/23 | 0.664 | 0.175 | 0.022 |
| 10/26/23 | 0.678 | 0.161 | 0.015 |
| 10/27/23 | 0.648 | 0.156 | 0.001 |
| 10/30/23 | 0.637 | 0.17 | 0.017 |
| 10/31/23 | 0.622 | 0.177 | 0.02 |
| 11/1/23 | 0.644 | 0.189 | 0.019 |
| 11/2/23 | 0.629 | 0.212 | 0.033 |
| 11/3/23 | 0.637 | 0.223 | 0.034 |
| 11/6/23 | 0.646 | 0.226 | 0.035 |
| 11/7/23 | 0.671 | 0.23 | 0.038 |
| 11/8/23 | 0.641 | 0.231 | 0.034 |
| 11/9/23 | 0.603 | 0.221 | 0.03 |
| 11/10/23 | 0.626 | 0.24 | 0.037 |
| 11/13/23 | 0.64 | 0.239 | 0.04 |
| 11/14/23 | 0.662 | 0.263 | 0.051 |
| 11/15/23 | 0.701 | 0.266 | 0.059 |
| 11/16/23 | 0.61 | 0.267 | 0.046 |
| 11/17/23 | 0.532 | 0.269 | 0.045 |